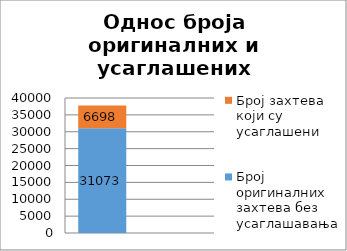
| Category | Број оригиналних захтева без усаглашавања | Број захтева који су усаглашени |
|---|---|---|
| 0 | 31073 | 6698 |
| 1 | 0.823 | 0.177 |